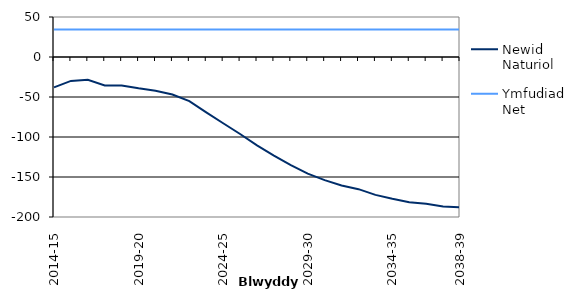
| Category | Newid Naturiol | Ymfudiad Net |
|---|---|---|
| 2014-15 | -38.005 | 34.475 |
|  | -29.904 | 34.475 |
|  | -28.471 | 34.475 |
|  | -35.538 | 34.475 |
|  | -35.631 | 34.475 |
| 2019-20 | -39.129 | 34.475 |
|  | -42.064 | 34.475 |
|  | -46.853 | 34.475 |
|  | -55.142 | 34.475 |
|  | -69.225 | 34.475 |
| 2024-25 | -82.847 | 34.475 |
|  | -96.211 | 34.475 |
|  | -110.442 | 34.475 |
|  | -123.171 | 34.475 |
|  | -135.114 | 34.475 |
| 2029-30 | -145.784 | 34.475 |
|  | -153.937 | 34.475 |
|  | -160.573 | 34.475 |
|  | -165.196 | 34.475 |
|  | -172.369 | 34.475 |
| 2034-35 | -177.241 | 34.475 |
|  | -181.592 | 34.475 |
|  | -183.408 | 34.475 |
|  | -186.836 | 34.475 |
| 2038-39 | -187.771 | 34.475 |